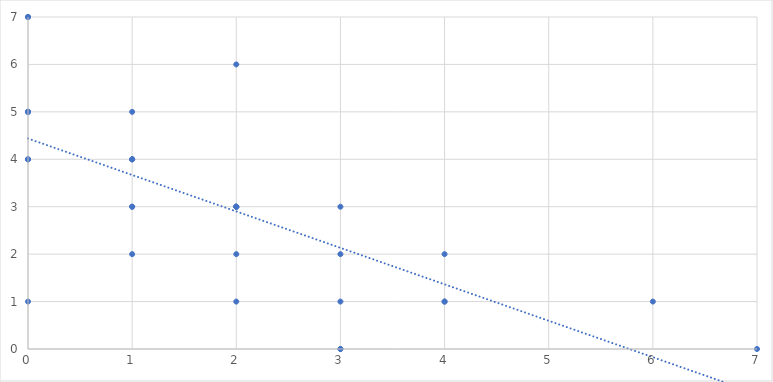
| Category | Series 0 |
|---|---|
| 1.0 | 2 |
| 4.0 | 2 |
| 4.0 | 1 |
| 0.0 | 7 |
| 7.0 | 0 |
| 2.0 | 6 |
| 1.0 | 3 |
| 0.0 | 7 |
| 0.0 | 5 |
| 0.0 | 5 |
| 2.0 | 2 |
| 1.0 | 4 |
| 0.0 | 5 |
| 4.0 | 1 |
| 0.0 | 4 |
| 2.0 | 3 |
| 3.0 | 1 |
| 0.0 | 5 |
| 0.0 | 1 |
| 2.0 | 3 |
| 0.0 | 4 |
| 0.0 | 4 |
| 1.0 | 5 |
| 2.0 | 1 |
| 2.0 | 3 |
| 1.0 | 4 |
| 6.0 | 1 |
| 3.0 | 0 |
| 3.0 | 2 |
| 3.0 | 0 |
| 3.0 | 3 |
| 2.0 | 3 |
| 1.0 | 4 |
| 1.0 | 3 |